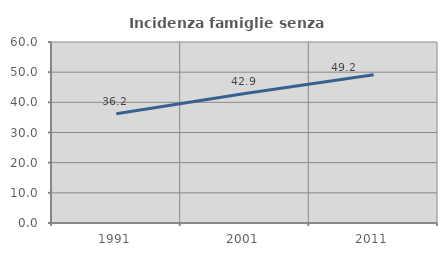
| Category | Incidenza famiglie senza nuclei |
|---|---|
| 1991.0 | 36.24 |
| 2001.0 | 42.91 |
| 2011.0 | 49.174 |